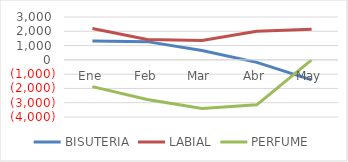
| Category | BISUTERIA | LABIAL | PERFUME |
|---|---|---|---|
| Ene | 1325 | 2200 | -1875 |
| Feb | 1275 | 1425 | -2775 |
| Mar | 650 | 1350 | -3400 |
| Abr | -175 | 2000 | -3150 |
| May | -1400 | 2150 | 0 |